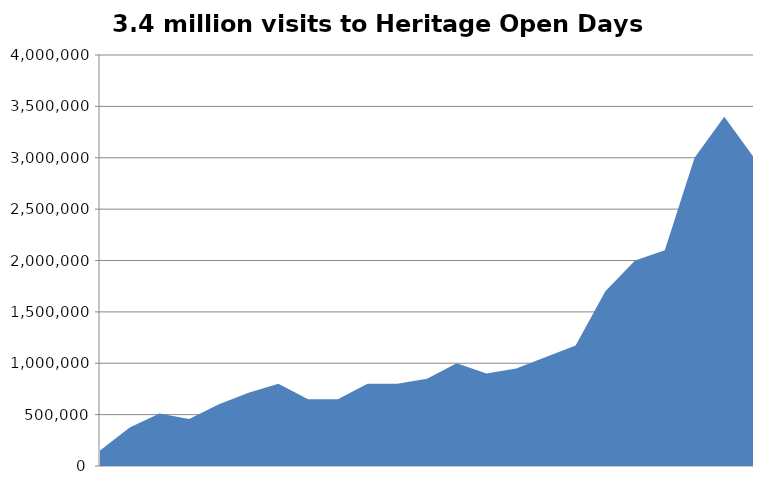
| Category | Number of HOD Visits | No. of visits per HOD event |
|---|---|---|
| 0 | 150000 | 213.98 |
| 1 | 375000 | 312.5 |
| 2 | 512000 | 364.154 |
| 3 | 457000 | 286.341 |
| 4 | 600000 | 354.4 |
| 5 | 712000 | 365.879 |
| 6 | 800000 | 322.841 |
| 7 | 650000 | 304.735 |
| 8 | 650000 | 298.576 |
| 9 | 800000 | 318.471 |
| 10 | 800000 | 285.714 |
| 11 | 850000 | 284.757 |
| 12 | 1000000 | 284.738 |
| 13 | 900000 | 255.247 |
| 14 | 950000 | 255.582 |
| 15 | 1062000 | 259.024 |
| 16 | 1172000 | 262.604 |
| 17 | 1700000 | 384.528 |
| 18 | 2000000 | 430.293 |
| 19 | 2100000 | 462.555 |
| 20 | 3000000 | 640.342 |
| 21 | 3400000 | 700.309 |
| 22 | 3000000 | 567 |